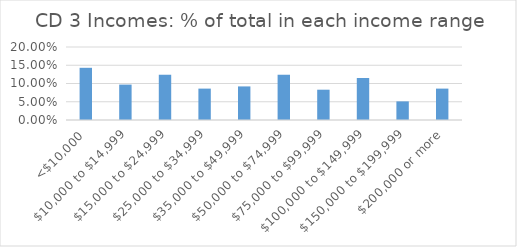
| Category | Series 0 |
|---|---|
| <$10,000 | 0.143 |
| $10,000 to $14,999 | 0.097 |
| $15,000 to $24,999 | 0.124 |
| $25,000 to $34,999 | 0.086 |
| $35,000 to $49,999 | 0.092 |
| $50,000 to $74,999 | 0.124 |
| $75,000 to $99,999 | 0.083 |
| $100,000 to $149,999 | 0.115 |
| $150,000 to $199,999 | 0.051 |
| $200,000 or more | 0.086 |